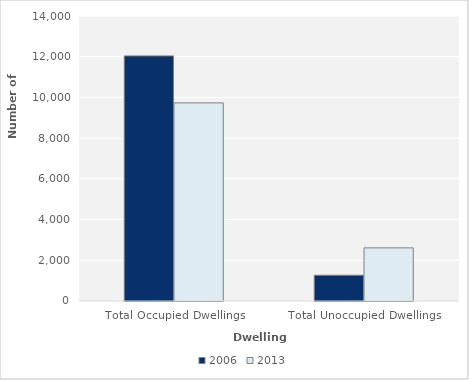
| Category | 2006 | 2013 |
|---|---|---|
| Total Occupied Dwellings | 12039 | 9732 |
| Total Unoccupied Dwellings | 1266 | 2610 |